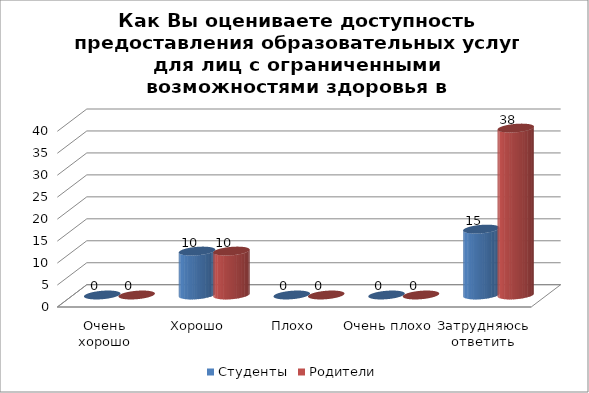
| Category | Студенты | Родители |
|---|---|---|
| Очень хорошо | 0 | 0 |
| Хорошо | 10 | 10 |
| Плохо | 0 | 0 |
| Очень плохо | 0 | 0 |
| Затрудняюсь ответить | 15 | 38 |